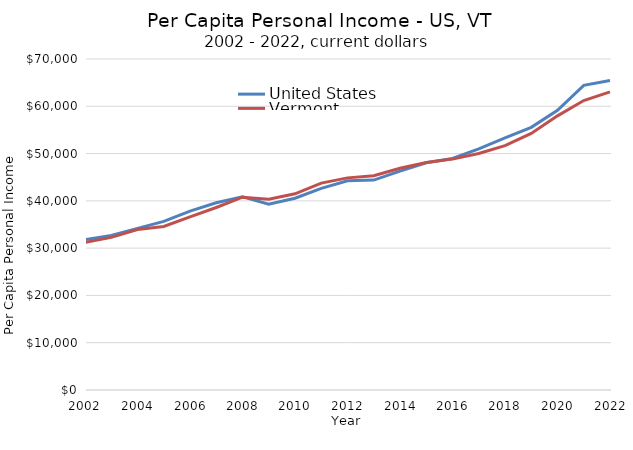
| Category | United States | Vermont |
|---|---|---|
| 2022 | 65470 | 63039 |
| 2021 | 64430 | 61214 |
| 2020 | 59153 | 57978 |
| 2019 | 55547 | 54257 |
| 2018 | 53309 | 51692 |
| 2017 | 51004 | 50011 |
| 2016 | 48971 | 48831 |
| 2015 | 48060 | 48120 |
| 2014 | 46287 | 46897 |
| 2013 | 44401 | 45298 |
| 2012 | 44237 | 44861 |
| 2011 | 42649 | 43756 |
| 2010 | 40557 | 41492 |
| 2009 | 39307 | 40358 |
| 2008 | 40854 | 40774 |
| 2007 | 39588 | 38595 |
| 2006 | 37843 | 36609 |
| 2005 | 35669 | 34573 |
| 2004 | 34183 | 33955 |
| 2003 | 32659 | 32282 |
| 2002 | 31801 | 31194 |